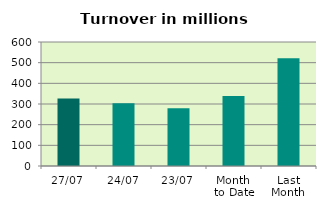
| Category | Series 0 |
|---|---|
| 27/07 | 326.823 |
| 24/07 | 304.09 |
| 23/07 | 279.01 |
| Month 
to Date | 338.306 |
| Last
Month | 521.023 |